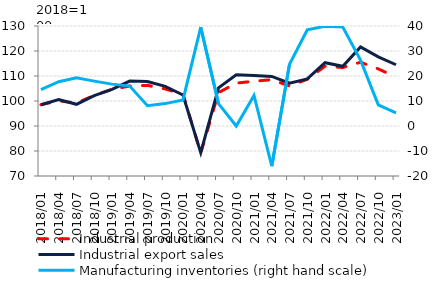
| Category | Industrial production | Industrial export sales |
|---|---|---|
| 2018-01-01 | 98.518 | 98.524 |
| 2018-04-01 | 100.074 | 100.613 |
| 2018-07-01 | 99.147 | 98.686 |
| 2018-10-01 | 102.262 | 102.176 |
| 2019-01-01 | 104.669 | 104.683 |
| 2019-04-01 | 105.986 | 107.979 |
| 2019-07-01 | 106.256 | 107.823 |
| 2019-10-01 | 104.814 | 105.846 |
| 2020-01-01 | 102.691 | 102.412 |
| 2020-04-01 | 79.173 | 79.338 |
| 2020-07-01 | 103.345 | 105.266 |
| 2020-10-01 | 107.164 | 110.459 |
| 2021-01-01 | 107.909 | 110.198 |
| 2021-04-01 | 108.543 | 109.838 |
| 2021-07-01 | 105.985 | 107.141 |
| 2021-10-01 | 108.69 | 108.831 |
| 2022-01-01 | 113.928 | 115.322 |
| 2022-04-01 | 113.378 | 113.904 |
| 2022-07-01 | 115.511 | 121.64 |
| 2022-10-01 | 112.84 | 117.648 |
| 2023-01-01 | 109.577 | 114.5 |